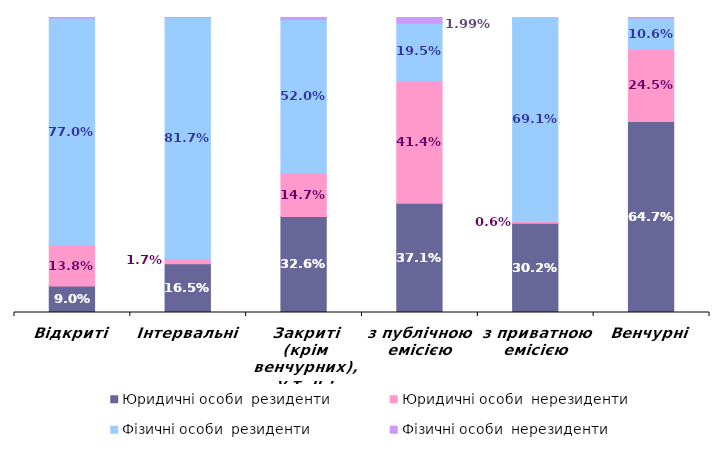
| Category | Юридичні особи  | Фізичні особи  |
|---|---|---|
| Відкриті | 0.138 | 0.002 |
| Інтервальні | 0.017 | 0 |
| Закриті (крім венчурних), у т. ч.: | 0.147 | 0.007 |
| з публічною емісією | 0.414 | 0.02 |
| з приватною емісією | 0.006 | 0 |
| Венчурні | 0.245 | 0.001 |